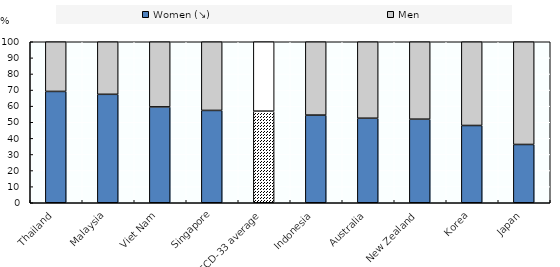
| Category | Women (↘) | Men |
|---|---|---|
| Thailand | 69.152 | 30.848 |
| Malaysia | 67.357 | 32.643 |
| Viet Nam | 59.53 | 40.47 |
| Singapore | 57.356 | 42.644 |
| OECD-33 average | 56.9 | 43.1 |
| Indonesia | 54.439 | 45.561 |
| Australia | 52.5 | 47.5 |
| New Zealand | 51.907 | 48.093 |
| Korea | 47.997 | 52.003 |
| Japan | 36.202 | 63.798 |